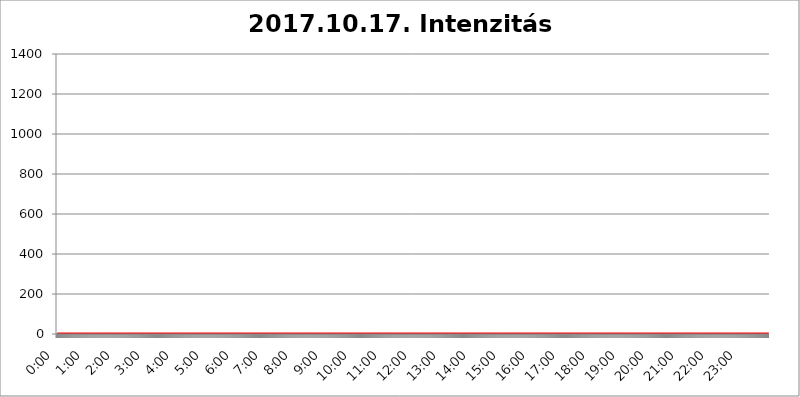
| Category | 2017.10.17. Intenzitás [W/m^2] |
|---|---|
| 0.0 | 0 |
| 0.0006944444444444445 | 0 |
| 0.001388888888888889 | 0 |
| 0.0020833333333333333 | 0 |
| 0.002777777777777778 | 0 |
| 0.003472222222222222 | 0 |
| 0.004166666666666667 | 0 |
| 0.004861111111111111 | 0 |
| 0.005555555555555556 | 0 |
| 0.0062499999999999995 | 0 |
| 0.006944444444444444 | 0 |
| 0.007638888888888889 | 0 |
| 0.008333333333333333 | 0 |
| 0.009027777777777779 | 0 |
| 0.009722222222222222 | 0 |
| 0.010416666666666666 | 0 |
| 0.011111111111111112 | 0 |
| 0.011805555555555555 | 0 |
| 0.012499999999999999 | 0 |
| 0.013194444444444444 | 0 |
| 0.013888888888888888 | 0 |
| 0.014583333333333332 | 0 |
| 0.015277777777777777 | 0 |
| 0.015972222222222224 | 0 |
| 0.016666666666666666 | 0 |
| 0.017361111111111112 | 0 |
| 0.018055555555555557 | 0 |
| 0.01875 | 0 |
| 0.019444444444444445 | 0 |
| 0.02013888888888889 | 0 |
| 0.020833333333333332 | 0 |
| 0.02152777777777778 | 0 |
| 0.022222222222222223 | 0 |
| 0.02291666666666667 | 0 |
| 0.02361111111111111 | 0 |
| 0.024305555555555556 | 0 |
| 0.024999999999999998 | 0 |
| 0.025694444444444447 | 0 |
| 0.02638888888888889 | 0 |
| 0.027083333333333334 | 0 |
| 0.027777777777777776 | 0 |
| 0.02847222222222222 | 0 |
| 0.029166666666666664 | 0 |
| 0.029861111111111113 | 0 |
| 0.030555555555555555 | 0 |
| 0.03125 | 0 |
| 0.03194444444444445 | 0 |
| 0.03263888888888889 | 0 |
| 0.03333333333333333 | 0 |
| 0.034027777777777775 | 0 |
| 0.034722222222222224 | 0 |
| 0.035416666666666666 | 0 |
| 0.036111111111111115 | 0 |
| 0.03680555555555556 | 0 |
| 0.0375 | 0 |
| 0.03819444444444444 | 0 |
| 0.03888888888888889 | 0 |
| 0.03958333333333333 | 0 |
| 0.04027777777777778 | 0 |
| 0.04097222222222222 | 0 |
| 0.041666666666666664 | 0 |
| 0.042361111111111106 | 0 |
| 0.04305555555555556 | 0 |
| 0.043750000000000004 | 0 |
| 0.044444444444444446 | 0 |
| 0.04513888888888889 | 0 |
| 0.04583333333333334 | 0 |
| 0.04652777777777778 | 0 |
| 0.04722222222222222 | 0 |
| 0.04791666666666666 | 0 |
| 0.04861111111111111 | 0 |
| 0.049305555555555554 | 0 |
| 0.049999999999999996 | 0 |
| 0.05069444444444445 | 0 |
| 0.051388888888888894 | 0 |
| 0.052083333333333336 | 0 |
| 0.05277777777777778 | 0 |
| 0.05347222222222222 | 0 |
| 0.05416666666666667 | 0 |
| 0.05486111111111111 | 0 |
| 0.05555555555555555 | 0 |
| 0.05625 | 0 |
| 0.05694444444444444 | 0 |
| 0.057638888888888885 | 0 |
| 0.05833333333333333 | 0 |
| 0.05902777777777778 | 0 |
| 0.059722222222222225 | 0 |
| 0.06041666666666667 | 0 |
| 0.061111111111111116 | 0 |
| 0.06180555555555556 | 0 |
| 0.0625 | 0 |
| 0.06319444444444444 | 0 |
| 0.06388888888888888 | 0 |
| 0.06458333333333334 | 0 |
| 0.06527777777777778 | 0 |
| 0.06597222222222222 | 0 |
| 0.06666666666666667 | 0 |
| 0.06736111111111111 | 0 |
| 0.06805555555555555 | 0 |
| 0.06874999999999999 | 0 |
| 0.06944444444444443 | 0 |
| 0.07013888888888889 | 0 |
| 0.07083333333333333 | 0 |
| 0.07152777777777779 | 0 |
| 0.07222222222222223 | 0 |
| 0.07291666666666667 | 0 |
| 0.07361111111111111 | 0 |
| 0.07430555555555556 | 0 |
| 0.075 | 0 |
| 0.07569444444444444 | 0 |
| 0.0763888888888889 | 0 |
| 0.07708333333333334 | 0 |
| 0.07777777777777778 | 0 |
| 0.07847222222222222 | 0 |
| 0.07916666666666666 | 0 |
| 0.0798611111111111 | 0 |
| 0.08055555555555556 | 0 |
| 0.08125 | 0 |
| 0.08194444444444444 | 0 |
| 0.08263888888888889 | 0 |
| 0.08333333333333333 | 0 |
| 0.08402777777777777 | 0 |
| 0.08472222222222221 | 0 |
| 0.08541666666666665 | 0 |
| 0.08611111111111112 | 0 |
| 0.08680555555555557 | 0 |
| 0.08750000000000001 | 0 |
| 0.08819444444444445 | 0 |
| 0.08888888888888889 | 0 |
| 0.08958333333333333 | 0 |
| 0.09027777777777778 | 0 |
| 0.09097222222222222 | 0 |
| 0.09166666666666667 | 0 |
| 0.09236111111111112 | 0 |
| 0.09305555555555556 | 0 |
| 0.09375 | 0 |
| 0.09444444444444444 | 0 |
| 0.09513888888888888 | 0 |
| 0.09583333333333333 | 0 |
| 0.09652777777777777 | 0 |
| 0.09722222222222222 | 0 |
| 0.09791666666666667 | 0 |
| 0.09861111111111111 | 0 |
| 0.09930555555555555 | 0 |
| 0.09999999999999999 | 0 |
| 0.10069444444444443 | 0 |
| 0.1013888888888889 | 0 |
| 0.10208333333333335 | 0 |
| 0.10277777777777779 | 0 |
| 0.10347222222222223 | 0 |
| 0.10416666666666667 | 0 |
| 0.10486111111111111 | 0 |
| 0.10555555555555556 | 0 |
| 0.10625 | 0 |
| 0.10694444444444444 | 0 |
| 0.1076388888888889 | 0 |
| 0.10833333333333334 | 0 |
| 0.10902777777777778 | 0 |
| 0.10972222222222222 | 0 |
| 0.1111111111111111 | 0 |
| 0.11180555555555556 | 0 |
| 0.11180555555555556 | 0 |
| 0.1125 | 0 |
| 0.11319444444444444 | 0 |
| 0.11388888888888889 | 0 |
| 0.11458333333333333 | 0 |
| 0.11527777777777777 | 0 |
| 0.11597222222222221 | 0 |
| 0.11666666666666665 | 0 |
| 0.1173611111111111 | 0 |
| 0.11805555555555557 | 0 |
| 0.11944444444444445 | 0 |
| 0.12013888888888889 | 0 |
| 0.12083333333333333 | 0 |
| 0.12152777777777778 | 0 |
| 0.12222222222222223 | 0 |
| 0.12291666666666667 | 0 |
| 0.12291666666666667 | 0 |
| 0.12361111111111112 | 0 |
| 0.12430555555555556 | 0 |
| 0.125 | 0 |
| 0.12569444444444444 | 0 |
| 0.12638888888888888 | 0 |
| 0.12708333333333333 | 0 |
| 0.16875 | 0 |
| 0.12847222222222224 | 0 |
| 0.12916666666666668 | 0 |
| 0.12986111111111112 | 0 |
| 0.13055555555555556 | 0 |
| 0.13125 | 0 |
| 0.13194444444444445 | 0 |
| 0.1326388888888889 | 0 |
| 0.13333333333333333 | 0 |
| 0.13402777777777777 | 0 |
| 0.13402777777777777 | 0 |
| 0.13472222222222222 | 0 |
| 0.13541666666666666 | 0 |
| 0.1361111111111111 | 0 |
| 0.13749999999999998 | 0 |
| 0.13819444444444443 | 0 |
| 0.1388888888888889 | 0 |
| 0.13958333333333334 | 0 |
| 0.14027777777777778 | 0 |
| 0.14097222222222222 | 0 |
| 0.14166666666666666 | 0 |
| 0.1423611111111111 | 0 |
| 0.14305555555555557 | 0 |
| 0.14375000000000002 | 0 |
| 0.14444444444444446 | 0 |
| 0.1451388888888889 | 0 |
| 0.1451388888888889 | 0 |
| 0.14652777777777778 | 0 |
| 0.14722222222222223 | 0 |
| 0.14791666666666667 | 0 |
| 0.1486111111111111 | 0 |
| 0.14930555555555555 | 0 |
| 0.15 | 0 |
| 0.15069444444444444 | 0 |
| 0.15138888888888888 | 0 |
| 0.15208333333333332 | 0 |
| 0.15277777777777776 | 0 |
| 0.15347222222222223 | 0 |
| 0.15416666666666667 | 0 |
| 0.15486111111111112 | 0 |
| 0.15555555555555556 | 0 |
| 0.15625 | 0 |
| 0.15694444444444444 | 0 |
| 0.15763888888888888 | 0 |
| 0.15833333333333333 | 0 |
| 0.15902777777777777 | 0 |
| 0.15972222222222224 | 0 |
| 0.16041666666666668 | 0 |
| 0.16111111111111112 | 0 |
| 0.16180555555555556 | 0 |
| 0.1625 | 0 |
| 0.16319444444444445 | 0 |
| 0.1638888888888889 | 0 |
| 0.16458333333333333 | 0 |
| 0.16527777777777777 | 0 |
| 0.16597222222222222 | 0 |
| 0.16666666666666666 | 0 |
| 0.1673611111111111 | 0 |
| 0.16805555555555554 | 0 |
| 0.16874999999999998 | 0 |
| 0.16944444444444443 | 0 |
| 0.17013888888888887 | 0 |
| 0.1708333333333333 | 0 |
| 0.17152777777777775 | 0 |
| 0.17222222222222225 | 0 |
| 0.1729166666666667 | 0 |
| 0.17361111111111113 | 0 |
| 0.17430555555555557 | 0 |
| 0.17500000000000002 | 0 |
| 0.17569444444444446 | 0 |
| 0.1763888888888889 | 0 |
| 0.17708333333333334 | 0 |
| 0.17777777777777778 | 0 |
| 0.17847222222222223 | 0 |
| 0.17916666666666667 | 0 |
| 0.1798611111111111 | 0 |
| 0.18055555555555555 | 0 |
| 0.18125 | 0 |
| 0.18194444444444444 | 0 |
| 0.1826388888888889 | 0 |
| 0.18333333333333335 | 0 |
| 0.1840277777777778 | 0 |
| 0.18472222222222223 | 0 |
| 0.18541666666666667 | 0 |
| 0.18611111111111112 | 0 |
| 0.18680555555555556 | 0 |
| 0.1875 | 0 |
| 0.18819444444444444 | 0 |
| 0.18888888888888888 | 0 |
| 0.18958333333333333 | 0 |
| 0.19027777777777777 | 0 |
| 0.1909722222222222 | 0 |
| 0.19166666666666665 | 0 |
| 0.19236111111111112 | 0 |
| 0.19305555555555554 | 0 |
| 0.19375 | 0 |
| 0.19444444444444445 | 0 |
| 0.1951388888888889 | 0 |
| 0.19583333333333333 | 0 |
| 0.19652777777777777 | 0 |
| 0.19722222222222222 | 0 |
| 0.19791666666666666 | 0 |
| 0.1986111111111111 | 0 |
| 0.19930555555555554 | 0 |
| 0.19999999999999998 | 0 |
| 0.20069444444444443 | 0 |
| 0.20138888888888887 | 0 |
| 0.2020833333333333 | 0 |
| 0.2027777777777778 | 0 |
| 0.2034722222222222 | 0 |
| 0.2041666666666667 | 0 |
| 0.20486111111111113 | 0 |
| 0.20555555555555557 | 0 |
| 0.20625000000000002 | 0 |
| 0.20694444444444446 | 0 |
| 0.2076388888888889 | 0 |
| 0.20833333333333334 | 0 |
| 0.20902777777777778 | 0 |
| 0.20972222222222223 | 0 |
| 0.21041666666666667 | 0 |
| 0.2111111111111111 | 0 |
| 0.21180555555555555 | 0 |
| 0.2125 | 0 |
| 0.21319444444444444 | 0 |
| 0.2138888888888889 | 0 |
| 0.21458333333333335 | 0 |
| 0.2152777777777778 | 0 |
| 0.21597222222222223 | 0 |
| 0.21666666666666667 | 0 |
| 0.21736111111111112 | 0 |
| 0.21805555555555556 | 0 |
| 0.21875 | 0 |
| 0.21944444444444444 | 0 |
| 0.22013888888888888 | 0 |
| 0.22083333333333333 | 0 |
| 0.22152777777777777 | 0 |
| 0.2222222222222222 | 0 |
| 0.22291666666666665 | 0 |
| 0.2236111111111111 | 0 |
| 0.22430555555555556 | 0 |
| 0.225 | 0 |
| 0.22569444444444445 | 0 |
| 0.2263888888888889 | 0 |
| 0.22708333333333333 | 0 |
| 0.22777777777777777 | 0 |
| 0.22847222222222222 | 0 |
| 0.22916666666666666 | 0 |
| 0.2298611111111111 | 0 |
| 0.23055555555555554 | 0 |
| 0.23124999999999998 | 0 |
| 0.23194444444444443 | 0 |
| 0.23263888888888887 | 0 |
| 0.2333333333333333 | 0 |
| 0.2340277777777778 | 0 |
| 0.2347222222222222 | 0 |
| 0.2354166666666667 | 0 |
| 0.23611111111111113 | 0 |
| 0.23680555555555557 | 0 |
| 0.23750000000000002 | 0 |
| 0.23819444444444446 | 0 |
| 0.2388888888888889 | 0 |
| 0.23958333333333334 | 0 |
| 0.24027777777777778 | 0 |
| 0.24097222222222223 | 0 |
| 0.24166666666666667 | 0 |
| 0.2423611111111111 | 0 |
| 0.24305555555555555 | 0 |
| 0.24375 | 0 |
| 0.24444444444444446 | 0 |
| 0.24513888888888888 | 0 |
| 0.24583333333333335 | 0 |
| 0.2465277777777778 | 0 |
| 0.24722222222222223 | 0 |
| 0.24791666666666667 | 0 |
| 0.24861111111111112 | 0 |
| 0.24930555555555556 | 0 |
| 0.25 | 0 |
| 0.25069444444444444 | 0 |
| 0.2513888888888889 | 0 |
| 0.2520833333333333 | 0 |
| 0.25277777777777777 | 0 |
| 0.2534722222222222 | 0 |
| 0.25416666666666665 | 0 |
| 0.2548611111111111 | 0 |
| 0.2555555555555556 | 0 |
| 0.25625000000000003 | 0 |
| 0.2569444444444445 | 0 |
| 0.2576388888888889 | 0 |
| 0.25833333333333336 | 0 |
| 0.2590277777777778 | 0 |
| 0.25972222222222224 | 0 |
| 0.2604166666666667 | 0 |
| 0.2611111111111111 | 0 |
| 0.26180555555555557 | 0 |
| 0.2625 | 0 |
| 0.26319444444444445 | 0 |
| 0.2638888888888889 | 0 |
| 0.26458333333333334 | 0 |
| 0.2652777777777778 | 0 |
| 0.2659722222222222 | 0 |
| 0.26666666666666666 | 0 |
| 0.2673611111111111 | 0 |
| 0.26805555555555555 | 0 |
| 0.26875 | 0 |
| 0.26944444444444443 | 0 |
| 0.2701388888888889 | 0 |
| 0.2708333333333333 | 0 |
| 0.27152777777777776 | 0 |
| 0.2722222222222222 | 0 |
| 0.27291666666666664 | 0 |
| 0.2736111111111111 | 0 |
| 0.2743055555555555 | 0 |
| 0.27499999999999997 | 0 |
| 0.27569444444444446 | 0 |
| 0.27638888888888885 | 0 |
| 0.27708333333333335 | 0 |
| 0.2777777777777778 | 0 |
| 0.27847222222222223 | 0 |
| 0.2791666666666667 | 0 |
| 0.2798611111111111 | 0 |
| 0.28055555555555556 | 0 |
| 0.28125 | 0 |
| 0.28194444444444444 | 0 |
| 0.2826388888888889 | 0 |
| 0.2833333333333333 | 0 |
| 0.28402777777777777 | 0 |
| 0.2847222222222222 | 0 |
| 0.28541666666666665 | 0 |
| 0.28611111111111115 | 0 |
| 0.28680555555555554 | 0 |
| 0.28750000000000003 | 0 |
| 0.2881944444444445 | 0 |
| 0.2888888888888889 | 0 |
| 0.28958333333333336 | 0 |
| 0.2902777777777778 | 0 |
| 0.29097222222222224 | 0 |
| 0.2916666666666667 | 0 |
| 0.2923611111111111 | 0 |
| 0.29305555555555557 | 0 |
| 0.29375 | 0 |
| 0.29444444444444445 | 0 |
| 0.2951388888888889 | 0 |
| 0.29583333333333334 | 0 |
| 0.2965277777777778 | 0 |
| 0.2972222222222222 | 0 |
| 0.29791666666666666 | 0 |
| 0.2986111111111111 | 0 |
| 0.29930555555555555 | 0 |
| 0.3 | 0 |
| 0.30069444444444443 | 0 |
| 0.3013888888888889 | 0 |
| 0.3020833333333333 | 0 |
| 0.30277777777777776 | 0 |
| 0.3034722222222222 | 0 |
| 0.30416666666666664 | 0 |
| 0.3048611111111111 | 0 |
| 0.3055555555555555 | 0 |
| 0.30624999999999997 | 0 |
| 0.3069444444444444 | 0 |
| 0.3076388888888889 | 0 |
| 0.30833333333333335 | 0 |
| 0.3090277777777778 | 0 |
| 0.30972222222222223 | 0 |
| 0.3104166666666667 | 0 |
| 0.3111111111111111 | 0 |
| 0.31180555555555556 | 0 |
| 0.3125 | 0 |
| 0.31319444444444444 | 0 |
| 0.3138888888888889 | 0 |
| 0.3145833333333333 | 0 |
| 0.31527777777777777 | 0 |
| 0.3159722222222222 | 0 |
| 0.31666666666666665 | 0 |
| 0.31736111111111115 | 0 |
| 0.31805555555555554 | 0 |
| 0.31875000000000003 | 0 |
| 0.3194444444444445 | 0 |
| 0.3201388888888889 | 0 |
| 0.32083333333333336 | 0 |
| 0.3215277777777778 | 0 |
| 0.32222222222222224 | 0 |
| 0.3229166666666667 | 0 |
| 0.3236111111111111 | 0 |
| 0.32430555555555557 | 0 |
| 0.325 | 0 |
| 0.32569444444444445 | 0 |
| 0.3263888888888889 | 0 |
| 0.32708333333333334 | 0 |
| 0.3277777777777778 | 0 |
| 0.3284722222222222 | 0 |
| 0.32916666666666666 | 0 |
| 0.3298611111111111 | 0 |
| 0.33055555555555555 | 0 |
| 0.33125 | 0 |
| 0.33194444444444443 | 0 |
| 0.3326388888888889 | 0 |
| 0.3333333333333333 | 0 |
| 0.3340277777777778 | 0 |
| 0.3347222222222222 | 0 |
| 0.3354166666666667 | 0 |
| 0.3361111111111111 | 0 |
| 0.3368055555555556 | 0 |
| 0.33749999999999997 | 0 |
| 0.33819444444444446 | 0 |
| 0.33888888888888885 | 0 |
| 0.33958333333333335 | 0 |
| 0.34027777777777773 | 0 |
| 0.34097222222222223 | 0 |
| 0.3416666666666666 | 0 |
| 0.3423611111111111 | 0 |
| 0.3430555555555555 | 0 |
| 0.34375 | 0 |
| 0.3444444444444445 | 0 |
| 0.3451388888888889 | 0 |
| 0.3458333333333334 | 0 |
| 0.34652777777777777 | 0 |
| 0.34722222222222227 | 0 |
| 0.34791666666666665 | 0 |
| 0.34861111111111115 | 0 |
| 0.34930555555555554 | 0 |
| 0.35000000000000003 | 0 |
| 0.3506944444444444 | 0 |
| 0.3513888888888889 | 0 |
| 0.3520833333333333 | 0 |
| 0.3527777777777778 | 0 |
| 0.3534722222222222 | 0 |
| 0.3541666666666667 | 0 |
| 0.3548611111111111 | 0 |
| 0.35555555555555557 | 0 |
| 0.35625 | 0 |
| 0.35694444444444445 | 0 |
| 0.3576388888888889 | 0 |
| 0.35833333333333334 | 0 |
| 0.3590277777777778 | 0 |
| 0.3597222222222222 | 0 |
| 0.36041666666666666 | 0 |
| 0.3611111111111111 | 0 |
| 0.36180555555555555 | 0 |
| 0.3625 | 0 |
| 0.36319444444444443 | 0 |
| 0.3638888888888889 | 0 |
| 0.3645833333333333 | 0 |
| 0.3652777777777778 | 0 |
| 0.3659722222222222 | 0 |
| 0.3666666666666667 | 0 |
| 0.3673611111111111 | 0 |
| 0.3680555555555556 | 0 |
| 0.36874999999999997 | 0 |
| 0.36944444444444446 | 0 |
| 0.37013888888888885 | 0 |
| 0.37083333333333335 | 0 |
| 0.37152777777777773 | 0 |
| 0.37222222222222223 | 0 |
| 0.3729166666666666 | 0 |
| 0.3736111111111111 | 0 |
| 0.3743055555555555 | 0 |
| 0.375 | 0 |
| 0.3756944444444445 | 0 |
| 0.3763888888888889 | 0 |
| 0.3770833333333334 | 0 |
| 0.37777777777777777 | 0 |
| 0.37847222222222227 | 0 |
| 0.37916666666666665 | 0 |
| 0.37986111111111115 | 0 |
| 0.38055555555555554 | 0 |
| 0.38125000000000003 | 0 |
| 0.3819444444444444 | 0 |
| 0.3826388888888889 | 0 |
| 0.3833333333333333 | 0 |
| 0.3840277777777778 | 0 |
| 0.3847222222222222 | 0 |
| 0.3854166666666667 | 0 |
| 0.3861111111111111 | 0 |
| 0.38680555555555557 | 0 |
| 0.3875 | 0 |
| 0.38819444444444445 | 0 |
| 0.3888888888888889 | 0 |
| 0.38958333333333334 | 0 |
| 0.3902777777777778 | 0 |
| 0.3909722222222222 | 0 |
| 0.39166666666666666 | 0 |
| 0.3923611111111111 | 0 |
| 0.39305555555555555 | 0 |
| 0.39375 | 0 |
| 0.39444444444444443 | 0 |
| 0.3951388888888889 | 0 |
| 0.3958333333333333 | 0 |
| 0.3965277777777778 | 0 |
| 0.3972222222222222 | 0 |
| 0.3979166666666667 | 0 |
| 0.3986111111111111 | 0 |
| 0.3993055555555556 | 0 |
| 0.39999999999999997 | 0 |
| 0.40069444444444446 | 0 |
| 0.40138888888888885 | 0 |
| 0.40208333333333335 | 0 |
| 0.40277777777777773 | 0 |
| 0.40347222222222223 | 0 |
| 0.4041666666666666 | 0 |
| 0.4048611111111111 | 0 |
| 0.4055555555555555 | 0 |
| 0.40625 | 0 |
| 0.4069444444444445 | 0 |
| 0.4076388888888889 | 0 |
| 0.4083333333333334 | 0 |
| 0.40902777777777777 | 0 |
| 0.40972222222222227 | 0 |
| 0.41041666666666665 | 0 |
| 0.41111111111111115 | 0 |
| 0.41180555555555554 | 0 |
| 0.41250000000000003 | 0 |
| 0.4131944444444444 | 0 |
| 0.4138888888888889 | 0 |
| 0.4145833333333333 | 0 |
| 0.4152777777777778 | 0 |
| 0.4159722222222222 | 0 |
| 0.4166666666666667 | 0 |
| 0.4173611111111111 | 0 |
| 0.41805555555555557 | 0 |
| 0.41875 | 0 |
| 0.41944444444444445 | 0 |
| 0.4201388888888889 | 0 |
| 0.42083333333333334 | 0 |
| 0.4215277777777778 | 0 |
| 0.4222222222222222 | 0 |
| 0.42291666666666666 | 0 |
| 0.4236111111111111 | 0 |
| 0.42430555555555555 | 0 |
| 0.425 | 0 |
| 0.42569444444444443 | 0 |
| 0.4263888888888889 | 0 |
| 0.4270833333333333 | 0 |
| 0.4277777777777778 | 0 |
| 0.4284722222222222 | 0 |
| 0.4291666666666667 | 0 |
| 0.4298611111111111 | 0 |
| 0.4305555555555556 | 0 |
| 0.43124999999999997 | 0 |
| 0.43194444444444446 | 0 |
| 0.43263888888888885 | 0 |
| 0.43333333333333335 | 0 |
| 0.43402777777777773 | 0 |
| 0.43472222222222223 | 0 |
| 0.4354166666666666 | 0 |
| 0.4361111111111111 | 0 |
| 0.4368055555555555 | 0 |
| 0.4375 | 0 |
| 0.4381944444444445 | 0 |
| 0.4388888888888889 | 0 |
| 0.4395833333333334 | 0 |
| 0.44027777777777777 | 0 |
| 0.44097222222222227 | 0 |
| 0.44166666666666665 | 0 |
| 0.44236111111111115 | 0 |
| 0.44305555555555554 | 0 |
| 0.44375000000000003 | 0 |
| 0.4444444444444444 | 0 |
| 0.4451388888888889 | 0 |
| 0.4458333333333333 | 0 |
| 0.4465277777777778 | 0 |
| 0.4472222222222222 | 0 |
| 0.4479166666666667 | 0 |
| 0.4486111111111111 | 0 |
| 0.44930555555555557 | 0 |
| 0.45 | 0 |
| 0.45069444444444445 | 0 |
| 0.4513888888888889 | 0 |
| 0.45208333333333334 | 0 |
| 0.4527777777777778 | 0 |
| 0.4534722222222222 | 0 |
| 0.45416666666666666 | 0 |
| 0.4548611111111111 | 0 |
| 0.45555555555555555 | 0 |
| 0.45625 | 0 |
| 0.45694444444444443 | 0 |
| 0.4576388888888889 | 0 |
| 0.4583333333333333 | 0 |
| 0.4590277777777778 | 0 |
| 0.4597222222222222 | 0 |
| 0.4604166666666667 | 0 |
| 0.4611111111111111 | 0 |
| 0.4618055555555556 | 0 |
| 0.46249999999999997 | 0 |
| 0.46319444444444446 | 0 |
| 0.46388888888888885 | 0 |
| 0.46458333333333335 | 0 |
| 0.46527777777777773 | 0 |
| 0.46597222222222223 | 0 |
| 0.4666666666666666 | 0 |
| 0.4673611111111111 | 0 |
| 0.4680555555555555 | 0 |
| 0.46875 | 0 |
| 0.4694444444444445 | 0 |
| 0.4701388888888889 | 0 |
| 0.4708333333333334 | 0 |
| 0.47152777777777777 | 0 |
| 0.47222222222222227 | 0 |
| 0.47291666666666665 | 0 |
| 0.47361111111111115 | 0 |
| 0.47430555555555554 | 0 |
| 0.47500000000000003 | 0 |
| 0.4756944444444444 | 0 |
| 0.4763888888888889 | 0 |
| 0.4770833333333333 | 0 |
| 0.4777777777777778 | 0 |
| 0.4784722222222222 | 0 |
| 0.4791666666666667 | 0 |
| 0.4798611111111111 | 0 |
| 0.48055555555555557 | 0 |
| 0.48125 | 0 |
| 0.48194444444444445 | 0 |
| 0.4826388888888889 | 0 |
| 0.48333333333333334 | 0 |
| 0.4840277777777778 | 0 |
| 0.4847222222222222 | 0 |
| 0.48541666666666666 | 0 |
| 0.4861111111111111 | 0 |
| 0.48680555555555555 | 0 |
| 0.4875 | 0 |
| 0.48819444444444443 | 0 |
| 0.4888888888888889 | 0 |
| 0.4895833333333333 | 0 |
| 0.4902777777777778 | 0 |
| 0.4909722222222222 | 0 |
| 0.4916666666666667 | 0 |
| 0.4923611111111111 | 0 |
| 0.4930555555555556 | 0 |
| 0.49374999999999997 | 0 |
| 0.49444444444444446 | 0 |
| 0.49513888888888885 | 0 |
| 0.49583333333333335 | 0 |
| 0.49652777777777773 | 0 |
| 0.49722222222222223 | 0 |
| 0.4979166666666666 | 0 |
| 0.4986111111111111 | 0 |
| 0.4993055555555555 | 0 |
| 0.5 | 0 |
| 0.5006944444444444 | 0 |
| 0.5013888888888889 | 0 |
| 0.5020833333333333 | 0 |
| 0.5027777777777778 | 0 |
| 0.5034722222222222 | 0 |
| 0.5041666666666667 | 0 |
| 0.5048611111111111 | 0 |
| 0.5055555555555555 | 0 |
| 0.50625 | 0 |
| 0.5069444444444444 | 0 |
| 0.5076388888888889 | 0 |
| 0.5083333333333333 | 0 |
| 0.5090277777777777 | 0 |
| 0.5097222222222222 | 0 |
| 0.5104166666666666 | 0 |
| 0.5111111111111112 | 0 |
| 0.5118055555555555 | 0 |
| 0.5125000000000001 | 0 |
| 0.5131944444444444 | 0 |
| 0.513888888888889 | 0 |
| 0.5145833333333333 | 0 |
| 0.5152777777777778 | 0 |
| 0.5159722222222222 | 0 |
| 0.5166666666666667 | 0 |
| 0.517361111111111 | 0 |
| 0.5180555555555556 | 0 |
| 0.5187499999999999 | 0 |
| 0.5194444444444445 | 0 |
| 0.5201388888888888 | 0 |
| 0.5208333333333334 | 0 |
| 0.5215277777777778 | 0 |
| 0.5222222222222223 | 0 |
| 0.5229166666666667 | 0 |
| 0.5236111111111111 | 0 |
| 0.5243055555555556 | 0 |
| 0.525 | 0 |
| 0.5256944444444445 | 0 |
| 0.5263888888888889 | 0 |
| 0.5270833333333333 | 0 |
| 0.5277777777777778 | 0 |
| 0.5284722222222222 | 0 |
| 0.5291666666666667 | 0 |
| 0.5298611111111111 | 0 |
| 0.5305555555555556 | 0 |
| 0.53125 | 0 |
| 0.5319444444444444 | 0 |
| 0.5326388888888889 | 0 |
| 0.5333333333333333 | 0 |
| 0.5340277777777778 | 0 |
| 0.5347222222222222 | 0 |
| 0.5354166666666667 | 0 |
| 0.5361111111111111 | 0 |
| 0.5368055555555555 | 0 |
| 0.5375 | 0 |
| 0.5381944444444444 | 0 |
| 0.5388888888888889 | 0 |
| 0.5395833333333333 | 0 |
| 0.5402777777777777 | 0 |
| 0.5409722222222222 | 0 |
| 0.5416666666666666 | 0 |
| 0.5423611111111112 | 0 |
| 0.5430555555555555 | 0 |
| 0.5437500000000001 | 0 |
| 0.5444444444444444 | 0 |
| 0.545138888888889 | 0 |
| 0.5458333333333333 | 0 |
| 0.5465277777777778 | 0 |
| 0.5472222222222222 | 0 |
| 0.5479166666666667 | 0 |
| 0.548611111111111 | 0 |
| 0.5493055555555556 | 0 |
| 0.5499999999999999 | 0 |
| 0.5506944444444445 | 0 |
| 0.5513888888888888 | 0 |
| 0.5520833333333334 | 0 |
| 0.5527777777777778 | 0 |
| 0.5534722222222223 | 0 |
| 0.5541666666666667 | 0 |
| 0.5548611111111111 | 0 |
| 0.5555555555555556 | 0 |
| 0.55625 | 0 |
| 0.5569444444444445 | 0 |
| 0.5576388888888889 | 0 |
| 0.5583333333333333 | 0 |
| 0.5590277777777778 | 0 |
| 0.5597222222222222 | 0 |
| 0.5604166666666667 | 0 |
| 0.5611111111111111 | 0 |
| 0.5618055555555556 | 0 |
| 0.5625 | 0 |
| 0.5631944444444444 | 0 |
| 0.5638888888888889 | 0 |
| 0.5645833333333333 | 0 |
| 0.5652777777777778 | 0 |
| 0.5659722222222222 | 0 |
| 0.5666666666666667 | 0 |
| 0.5673611111111111 | 0 |
| 0.5680555555555555 | 0 |
| 0.56875 | 0 |
| 0.5694444444444444 | 0 |
| 0.5701388888888889 | 0 |
| 0.5708333333333333 | 0 |
| 0.5715277777777777 | 0 |
| 0.5722222222222222 | 0 |
| 0.5729166666666666 | 0 |
| 0.5736111111111112 | 0 |
| 0.5743055555555555 | 0 |
| 0.5750000000000001 | 0 |
| 0.5756944444444444 | 0 |
| 0.576388888888889 | 0 |
| 0.5770833333333333 | 0 |
| 0.5777777777777778 | 0 |
| 0.5784722222222222 | 0 |
| 0.5791666666666667 | 0 |
| 0.579861111111111 | 0 |
| 0.5805555555555556 | 0 |
| 0.5812499999999999 | 0 |
| 0.5819444444444445 | 0 |
| 0.5826388888888888 | 0 |
| 0.5833333333333334 | 0 |
| 0.5840277777777778 | 0 |
| 0.5847222222222223 | 0 |
| 0.5854166666666667 | 0 |
| 0.5861111111111111 | 0 |
| 0.5868055555555556 | 0 |
| 0.5875 | 0 |
| 0.5881944444444445 | 0 |
| 0.5888888888888889 | 0 |
| 0.5895833333333333 | 0 |
| 0.5902777777777778 | 0 |
| 0.5909722222222222 | 0 |
| 0.5916666666666667 | 0 |
| 0.5923611111111111 | 0 |
| 0.5930555555555556 | 0 |
| 0.59375 | 0 |
| 0.5944444444444444 | 0 |
| 0.5951388888888889 | 0 |
| 0.5958333333333333 | 0 |
| 0.5965277777777778 | 0 |
| 0.5972222222222222 | 0 |
| 0.5979166666666667 | 0 |
| 0.5986111111111111 | 0 |
| 0.5993055555555555 | 0 |
| 0.6 | 0 |
| 0.6006944444444444 | 0 |
| 0.6013888888888889 | 0 |
| 0.6020833333333333 | 0 |
| 0.6027777777777777 | 0 |
| 0.6034722222222222 | 0 |
| 0.6041666666666666 | 0 |
| 0.6048611111111112 | 0 |
| 0.6055555555555555 | 0 |
| 0.6062500000000001 | 0 |
| 0.6069444444444444 | 0 |
| 0.607638888888889 | 0 |
| 0.6083333333333333 | 0 |
| 0.6090277777777778 | 0 |
| 0.6097222222222222 | 0 |
| 0.6104166666666667 | 0 |
| 0.611111111111111 | 0 |
| 0.6118055555555556 | 0 |
| 0.6124999999999999 | 0 |
| 0.6131944444444445 | 0 |
| 0.6138888888888888 | 0 |
| 0.6145833333333334 | 0 |
| 0.6152777777777778 | 0 |
| 0.6159722222222223 | 0 |
| 0.6166666666666667 | 0 |
| 0.6173611111111111 | 0 |
| 0.6180555555555556 | 0 |
| 0.61875 | 0 |
| 0.6194444444444445 | 0 |
| 0.6201388888888889 | 0 |
| 0.6208333333333333 | 0 |
| 0.6215277777777778 | 0 |
| 0.6222222222222222 | 0 |
| 0.6229166666666667 | 0 |
| 0.6236111111111111 | 0 |
| 0.6243055555555556 | 0 |
| 0.625 | 0 |
| 0.6256944444444444 | 0 |
| 0.6263888888888889 | 0 |
| 0.6270833333333333 | 0 |
| 0.6277777777777778 | 0 |
| 0.6284722222222222 | 0 |
| 0.6291666666666667 | 0 |
| 0.6298611111111111 | 0 |
| 0.6305555555555555 | 0 |
| 0.63125 | 0 |
| 0.6319444444444444 | 0 |
| 0.6326388888888889 | 0 |
| 0.6333333333333333 | 0 |
| 0.6340277777777777 | 0 |
| 0.6347222222222222 | 0 |
| 0.6354166666666666 | 0 |
| 0.6361111111111112 | 0 |
| 0.6368055555555555 | 0 |
| 0.6375000000000001 | 0 |
| 0.6381944444444444 | 0 |
| 0.638888888888889 | 0 |
| 0.6395833333333333 | 0 |
| 0.6402777777777778 | 0 |
| 0.6409722222222222 | 0 |
| 0.6416666666666667 | 0 |
| 0.642361111111111 | 0 |
| 0.6430555555555556 | 0 |
| 0.6437499999999999 | 0 |
| 0.6444444444444445 | 0 |
| 0.6451388888888888 | 0 |
| 0.6458333333333334 | 0 |
| 0.6465277777777778 | 0 |
| 0.6472222222222223 | 0 |
| 0.6479166666666667 | 0 |
| 0.6486111111111111 | 0 |
| 0.6493055555555556 | 0 |
| 0.65 | 0 |
| 0.6506944444444445 | 0 |
| 0.6513888888888889 | 0 |
| 0.6520833333333333 | 0 |
| 0.6527777777777778 | 0 |
| 0.6534722222222222 | 0 |
| 0.6541666666666667 | 0 |
| 0.6548611111111111 | 0 |
| 0.6555555555555556 | 0 |
| 0.65625 | 0 |
| 0.6569444444444444 | 0 |
| 0.6576388888888889 | 0 |
| 0.6583333333333333 | 0 |
| 0.6590277777777778 | 0 |
| 0.6597222222222222 | 0 |
| 0.6604166666666667 | 0 |
| 0.6611111111111111 | 0 |
| 0.6618055555555555 | 0 |
| 0.6625 | 0 |
| 0.6631944444444444 | 0 |
| 0.6638888888888889 | 0 |
| 0.6645833333333333 | 0 |
| 0.6652777777777777 | 0 |
| 0.6659722222222222 | 0 |
| 0.6666666666666666 | 0 |
| 0.6673611111111111 | 0 |
| 0.6680555555555556 | 0 |
| 0.6687500000000001 | 0 |
| 0.6694444444444444 | 0 |
| 0.6701388888888888 | 0 |
| 0.6708333333333334 | 0 |
| 0.6715277777777778 | 0 |
| 0.6722222222222222 | 0 |
| 0.6729166666666666 | 0 |
| 0.6736111111111112 | 0 |
| 0.6743055555555556 | 0 |
| 0.6749999999999999 | 0 |
| 0.6756944444444444 | 0 |
| 0.6763888888888889 | 0 |
| 0.6770833333333334 | 0 |
| 0.6777777777777777 | 0 |
| 0.6784722222222223 | 0 |
| 0.6791666666666667 | 0 |
| 0.6798611111111111 | 0 |
| 0.6805555555555555 | 0 |
| 0.68125 | 0 |
| 0.6819444444444445 | 0 |
| 0.6826388888888889 | 0 |
| 0.6833333333333332 | 0 |
| 0.6840277777777778 | 0 |
| 0.6847222222222222 | 0 |
| 0.6854166666666667 | 0 |
| 0.686111111111111 | 0 |
| 0.6868055555555556 | 0 |
| 0.6875 | 0 |
| 0.6881944444444444 | 0 |
| 0.688888888888889 | 0 |
| 0.6895833333333333 | 0 |
| 0.6902777777777778 | 0 |
| 0.6909722222222222 | 0 |
| 0.6916666666666668 | 0 |
| 0.6923611111111111 | 0 |
| 0.6930555555555555 | 0 |
| 0.69375 | 0 |
| 0.6944444444444445 | 0 |
| 0.6951388888888889 | 0 |
| 0.6958333333333333 | 0 |
| 0.6965277777777777 | 0 |
| 0.6972222222222223 | 0 |
| 0.6979166666666666 | 0 |
| 0.6986111111111111 | 0 |
| 0.6993055555555556 | 0 |
| 0.7000000000000001 | 0 |
| 0.7006944444444444 | 0 |
| 0.7013888888888888 | 0 |
| 0.7020833333333334 | 0 |
| 0.7027777777777778 | 0 |
| 0.7034722222222222 | 0 |
| 0.7041666666666666 | 0 |
| 0.7048611111111112 | 0 |
| 0.7055555555555556 | 0 |
| 0.7062499999999999 | 0 |
| 0.7069444444444444 | 0 |
| 0.7076388888888889 | 0 |
| 0.7083333333333334 | 0 |
| 0.7090277777777777 | 0 |
| 0.7097222222222223 | 0 |
| 0.7104166666666667 | 0 |
| 0.7111111111111111 | 0 |
| 0.7118055555555555 | 0 |
| 0.7125 | 0 |
| 0.7131944444444445 | 0 |
| 0.7138888888888889 | 0 |
| 0.7145833333333332 | 0 |
| 0.7152777777777778 | 0 |
| 0.7159722222222222 | 0 |
| 0.7166666666666667 | 0 |
| 0.717361111111111 | 0 |
| 0.7180555555555556 | 0 |
| 0.71875 | 0 |
| 0.7194444444444444 | 0 |
| 0.720138888888889 | 0 |
| 0.7208333333333333 | 0 |
| 0.7215277777777778 | 0 |
| 0.7222222222222222 | 0 |
| 0.7229166666666668 | 0 |
| 0.7236111111111111 | 0 |
| 0.7243055555555555 | 0 |
| 0.725 | 0 |
| 0.7256944444444445 | 0 |
| 0.7263888888888889 | 0 |
| 0.7270833333333333 | 0 |
| 0.7277777777777777 | 0 |
| 0.7284722222222223 | 0 |
| 0.7291666666666666 | 0 |
| 0.7298611111111111 | 0 |
| 0.7305555555555556 | 0 |
| 0.7312500000000001 | 0 |
| 0.7319444444444444 | 0 |
| 0.7326388888888888 | 0 |
| 0.7333333333333334 | 0 |
| 0.7340277777777778 | 0 |
| 0.7347222222222222 | 0 |
| 0.7354166666666666 | 0 |
| 0.7361111111111112 | 0 |
| 0.7368055555555556 | 0 |
| 0.7374999999999999 | 0 |
| 0.7381944444444444 | 0 |
| 0.7388888888888889 | 0 |
| 0.7395833333333334 | 0 |
| 0.7402777777777777 | 0 |
| 0.7409722222222223 | 0 |
| 0.7416666666666667 | 0 |
| 0.7423611111111111 | 0 |
| 0.7430555555555555 | 0 |
| 0.74375 | 0 |
| 0.7444444444444445 | 0 |
| 0.7451388888888889 | 0 |
| 0.7458333333333332 | 0 |
| 0.7465277777777778 | 0 |
| 0.7472222222222222 | 0 |
| 0.7479166666666667 | 0 |
| 0.748611111111111 | 0 |
| 0.7493055555555556 | 0 |
| 0.75 | 0 |
| 0.7506944444444444 | 0 |
| 0.751388888888889 | 0 |
| 0.7520833333333333 | 0 |
| 0.7527777777777778 | 0 |
| 0.7534722222222222 | 0 |
| 0.7541666666666668 | 0 |
| 0.7548611111111111 | 0 |
| 0.7555555555555555 | 0 |
| 0.75625 | 0 |
| 0.7569444444444445 | 0 |
| 0.7576388888888889 | 0 |
| 0.7583333333333333 | 0 |
| 0.7590277777777777 | 0 |
| 0.7597222222222223 | 0 |
| 0.7604166666666666 | 0 |
| 0.7611111111111111 | 0 |
| 0.7618055555555556 | 0 |
| 0.7625000000000001 | 0 |
| 0.7631944444444444 | 0 |
| 0.7638888888888888 | 0 |
| 0.7645833333333334 | 0 |
| 0.7652777777777778 | 0 |
| 0.7659722222222222 | 0 |
| 0.7666666666666666 | 0 |
| 0.7673611111111112 | 0 |
| 0.7680555555555556 | 0 |
| 0.7687499999999999 | 0 |
| 0.7694444444444444 | 0 |
| 0.7701388888888889 | 0 |
| 0.7708333333333334 | 0 |
| 0.7715277777777777 | 0 |
| 0.7722222222222223 | 0 |
| 0.7729166666666667 | 0 |
| 0.7736111111111111 | 0 |
| 0.7743055555555555 | 0 |
| 0.775 | 0 |
| 0.7756944444444445 | 0 |
| 0.7763888888888889 | 0 |
| 0.7770833333333332 | 0 |
| 0.7777777777777778 | 0 |
| 0.7784722222222222 | 0 |
| 0.7791666666666667 | 0 |
| 0.779861111111111 | 0 |
| 0.7805555555555556 | 0 |
| 0.78125 | 0 |
| 0.7819444444444444 | 0 |
| 0.782638888888889 | 0 |
| 0.7833333333333333 | 0 |
| 0.7840277777777778 | 0 |
| 0.7847222222222222 | 0 |
| 0.7854166666666668 | 0 |
| 0.7861111111111111 | 0 |
| 0.7868055555555555 | 0 |
| 0.7875 | 0 |
| 0.7881944444444445 | 0 |
| 0.7888888888888889 | 0 |
| 0.7895833333333333 | 0 |
| 0.7902777777777777 | 0 |
| 0.7909722222222223 | 0 |
| 0.7916666666666666 | 0 |
| 0.7923611111111111 | 0 |
| 0.7930555555555556 | 0 |
| 0.7937500000000001 | 0 |
| 0.7944444444444444 | 0 |
| 0.7951388888888888 | 0 |
| 0.7958333333333334 | 0 |
| 0.7965277777777778 | 0 |
| 0.7972222222222222 | 0 |
| 0.7979166666666666 | 0 |
| 0.7986111111111112 | 0 |
| 0.7993055555555556 | 0 |
| 0.7999999999999999 | 0 |
| 0.8006944444444444 | 0 |
| 0.8013888888888889 | 0 |
| 0.8020833333333334 | 0 |
| 0.8027777777777777 | 0 |
| 0.8034722222222223 | 0 |
| 0.8041666666666667 | 0 |
| 0.8048611111111111 | 0 |
| 0.8055555555555555 | 0 |
| 0.80625 | 0 |
| 0.8069444444444445 | 0 |
| 0.8076388888888889 | 0 |
| 0.8083333333333332 | 0 |
| 0.8090277777777778 | 0 |
| 0.8097222222222222 | 0 |
| 0.8104166666666667 | 0 |
| 0.811111111111111 | 0 |
| 0.8118055555555556 | 0 |
| 0.8125 | 0 |
| 0.8131944444444444 | 0 |
| 0.813888888888889 | 0 |
| 0.8145833333333333 | 0 |
| 0.8152777777777778 | 0 |
| 0.8159722222222222 | 0 |
| 0.8166666666666668 | 0 |
| 0.8173611111111111 | 0 |
| 0.8180555555555555 | 0 |
| 0.81875 | 0 |
| 0.8194444444444445 | 0 |
| 0.8201388888888889 | 0 |
| 0.8208333333333333 | 0 |
| 0.8215277777777777 | 0 |
| 0.8222222222222223 | 0 |
| 0.8229166666666666 | 0 |
| 0.8236111111111111 | 0 |
| 0.8243055555555556 | 0 |
| 0.8250000000000001 | 0 |
| 0.8256944444444444 | 0 |
| 0.8263888888888888 | 0 |
| 0.8270833333333334 | 0 |
| 0.8277777777777778 | 0 |
| 0.8284722222222222 | 0 |
| 0.8291666666666666 | 0 |
| 0.8298611111111112 | 0 |
| 0.8305555555555556 | 0 |
| 0.8312499999999999 | 0 |
| 0.8319444444444444 | 0 |
| 0.8326388888888889 | 0 |
| 0.8333333333333334 | 0 |
| 0.8340277777777777 | 0 |
| 0.8347222222222223 | 0 |
| 0.8354166666666667 | 0 |
| 0.8361111111111111 | 0 |
| 0.8368055555555555 | 0 |
| 0.8375 | 0 |
| 0.8381944444444445 | 0 |
| 0.8388888888888889 | 0 |
| 0.8395833333333332 | 0 |
| 0.8402777777777778 | 0 |
| 0.8409722222222222 | 0 |
| 0.8416666666666667 | 0 |
| 0.842361111111111 | 0 |
| 0.8430555555555556 | 0 |
| 0.84375 | 0 |
| 0.8444444444444444 | 0 |
| 0.845138888888889 | 0 |
| 0.8458333333333333 | 0 |
| 0.8465277777777778 | 0 |
| 0.8472222222222222 | 0 |
| 0.8479166666666668 | 0 |
| 0.8486111111111111 | 0 |
| 0.8493055555555555 | 0 |
| 0.85 | 0 |
| 0.8506944444444445 | 0 |
| 0.8513888888888889 | 0 |
| 0.8520833333333333 | 0 |
| 0.8527777777777777 | 0 |
| 0.8534722222222223 | 0 |
| 0.8541666666666666 | 0 |
| 0.8548611111111111 | 0 |
| 0.8555555555555556 | 0 |
| 0.8562500000000001 | 0 |
| 0.8569444444444444 | 0 |
| 0.8576388888888888 | 0 |
| 0.8583333333333334 | 0 |
| 0.8590277777777778 | 0 |
| 0.8597222222222222 | 0 |
| 0.8604166666666666 | 0 |
| 0.8611111111111112 | 0 |
| 0.8618055555555556 | 0 |
| 0.8624999999999999 | 0 |
| 0.8631944444444444 | 0 |
| 0.8638888888888889 | 0 |
| 0.8645833333333334 | 0 |
| 0.8652777777777777 | 0 |
| 0.8659722222222223 | 0 |
| 0.8666666666666667 | 0 |
| 0.8673611111111111 | 0 |
| 0.8680555555555555 | 0 |
| 0.86875 | 0 |
| 0.8694444444444445 | 0 |
| 0.8701388888888889 | 0 |
| 0.8708333333333332 | 0 |
| 0.8715277777777778 | 0 |
| 0.8722222222222222 | 0 |
| 0.8729166666666667 | 0 |
| 0.873611111111111 | 0 |
| 0.8743055555555556 | 0 |
| 0.875 | 0 |
| 0.8756944444444444 | 0 |
| 0.876388888888889 | 0 |
| 0.8770833333333333 | 0 |
| 0.8777777777777778 | 0 |
| 0.8784722222222222 | 0 |
| 0.8791666666666668 | 0 |
| 0.8798611111111111 | 0 |
| 0.8805555555555555 | 0 |
| 0.88125 | 0 |
| 0.8819444444444445 | 0 |
| 0.8826388888888889 | 0 |
| 0.8833333333333333 | 0 |
| 0.8840277777777777 | 0 |
| 0.8847222222222223 | 0 |
| 0.8854166666666666 | 0 |
| 0.8861111111111111 | 0 |
| 0.8868055555555556 | 0 |
| 0.8875000000000001 | 0 |
| 0.8881944444444444 | 0 |
| 0.8888888888888888 | 0 |
| 0.8895833333333334 | 0 |
| 0.8902777777777778 | 0 |
| 0.8909722222222222 | 0 |
| 0.8916666666666666 | 0 |
| 0.8923611111111112 | 0 |
| 0.8930555555555556 | 0 |
| 0.8937499999999999 | 0 |
| 0.8944444444444444 | 0 |
| 0.8951388888888889 | 0 |
| 0.8958333333333334 | 0 |
| 0.8965277777777777 | 0 |
| 0.8972222222222223 | 0 |
| 0.8979166666666667 | 0 |
| 0.8986111111111111 | 0 |
| 0.8993055555555555 | 0 |
| 0.9 | 0 |
| 0.9006944444444445 | 0 |
| 0.9013888888888889 | 0 |
| 0.9020833333333332 | 0 |
| 0.9027777777777778 | 0 |
| 0.9034722222222222 | 0 |
| 0.9041666666666667 | 0 |
| 0.904861111111111 | 0 |
| 0.9055555555555556 | 0 |
| 0.90625 | 0 |
| 0.9069444444444444 | 0 |
| 0.907638888888889 | 0 |
| 0.9083333333333333 | 0 |
| 0.9090277777777778 | 0 |
| 0.9097222222222222 | 0 |
| 0.9104166666666668 | 0 |
| 0.9111111111111111 | 0 |
| 0.9118055555555555 | 0 |
| 0.9125 | 0 |
| 0.9131944444444445 | 0 |
| 0.9138888888888889 | 0 |
| 0.9145833333333333 | 0 |
| 0.9152777777777777 | 0 |
| 0.9159722222222223 | 0 |
| 0.9166666666666666 | 0 |
| 0.9173611111111111 | 0 |
| 0.9180555555555556 | 0 |
| 0.9187500000000001 | 0 |
| 0.9194444444444444 | 0 |
| 0.9201388888888888 | 0 |
| 0.9208333333333334 | 0 |
| 0.9215277777777778 | 0 |
| 0.9222222222222222 | 0 |
| 0.9229166666666666 | 0 |
| 0.9236111111111112 | 0 |
| 0.9243055555555556 | 0 |
| 0.9249999999999999 | 0 |
| 0.9256944444444444 | 0 |
| 0.9263888888888889 | 0 |
| 0.9270833333333334 | 0 |
| 0.9277777777777777 | 0 |
| 0.9284722222222223 | 0 |
| 0.9291666666666667 | 0 |
| 0.9298611111111111 | 0 |
| 0.9305555555555555 | 0 |
| 0.93125 | 0 |
| 0.9319444444444445 | 0 |
| 0.9326388888888889 | 0 |
| 0.9333333333333332 | 0 |
| 0.9340277777777778 | 0 |
| 0.9347222222222222 | 0 |
| 0.9354166666666667 | 0 |
| 0.936111111111111 | 0 |
| 0.9368055555555556 | 0 |
| 0.9375 | 0 |
| 0.9381944444444444 | 0 |
| 0.938888888888889 | 0 |
| 0.9395833333333333 | 0 |
| 0.9402777777777778 | 0 |
| 0.9409722222222222 | 0 |
| 0.9416666666666668 | 0 |
| 0.9423611111111111 | 0 |
| 0.9430555555555555 | 0 |
| 0.94375 | 0 |
| 0.9444444444444445 | 0 |
| 0.9451388888888889 | 0 |
| 0.9458333333333333 | 0 |
| 0.9465277777777777 | 0 |
| 0.9472222222222223 | 0 |
| 0.9479166666666666 | 0 |
| 0.9486111111111111 | 0 |
| 0.9493055555555556 | 0 |
| 0.9500000000000001 | 0 |
| 0.9506944444444444 | 0 |
| 0.9513888888888888 | 0 |
| 0.9520833333333334 | 0 |
| 0.9527777777777778 | 0 |
| 0.9534722222222222 | 0 |
| 0.9541666666666666 | 0 |
| 0.9548611111111112 | 0 |
| 0.9555555555555556 | 0 |
| 0.9562499999999999 | 0 |
| 0.9569444444444444 | 0 |
| 0.9576388888888889 | 0 |
| 0.9583333333333334 | 0 |
| 0.9590277777777777 | 0 |
| 0.9597222222222223 | 0 |
| 0.9604166666666667 | 0 |
| 0.9611111111111111 | 0 |
| 0.9618055555555555 | 0 |
| 0.9625 | 0 |
| 0.9631944444444445 | 0 |
| 0.9638888888888889 | 0 |
| 0.9645833333333332 | 0 |
| 0.9652777777777778 | 0 |
| 0.9659722222222222 | 0 |
| 0.9666666666666667 | 0 |
| 0.967361111111111 | 0 |
| 0.9680555555555556 | 0 |
| 0.96875 | 0 |
| 0.9694444444444444 | 0 |
| 0.970138888888889 | 0 |
| 0.9708333333333333 | 0 |
| 0.9715277777777778 | 0 |
| 0.9722222222222222 | 0 |
| 0.9729166666666668 | 0 |
| 0.9736111111111111 | 0 |
| 0.9743055555555555 | 0 |
| 0.975 | 0 |
| 0.9756944444444445 | 0 |
| 0.9763888888888889 | 0 |
| 0.9770833333333333 | 0 |
| 0.9777777777777777 | 0 |
| 0.9784722222222223 | 0 |
| 0.9791666666666666 | 0 |
| 0.9798611111111111 | 0 |
| 0.9805555555555556 | 0 |
| 0.9812500000000001 | 0 |
| 0.9819444444444444 | 0 |
| 0.9826388888888888 | 0 |
| 0.9833333333333334 | 0 |
| 0.9840277777777778 | 0 |
| 0.9847222222222222 | 0 |
| 0.9854166666666666 | 0 |
| 0.9861111111111112 | 0 |
| 0.9868055555555556 | 0 |
| 0.9874999999999999 | 0 |
| 0.9881944444444444 | 0 |
| 0.9888888888888889 | 0 |
| 0.9895833333333334 | 0 |
| 0.9902777777777777 | 0 |
| 0.9909722222222223 | 0 |
| 0.9916666666666667 | 0 |
| 0.9923611111111111 | 0 |
| 0.9930555555555555 | 0 |
| 0.99375 | 0 |
| 0.9944444444444445 | 0 |
| 0.9951388888888889 | 0 |
| 0.9958333333333332 | 0 |
| 0.9965277777777778 | 0 |
| 0.9972222222222222 | 0 |
| 0.9979166666666667 | 0 |
| 0.998611111111111 | 0 |
| 0.9993055555555556 | 0 |